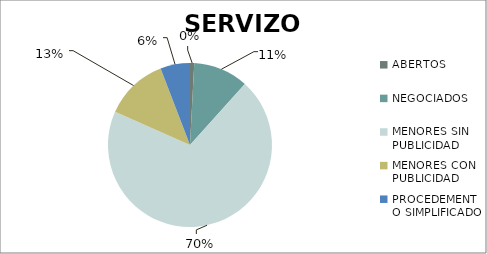
| Category | Series 0 |
|---|---|
| ABERTOS  | 1 |
| NEGOCIADOS  | 13 |
| MENORES SIN PUBLICIDAD | 84 |
| MENORES CON PUBLICIDAD | 15 |
| PROCEDEMENTO SIMPLIFICADO | 7 |